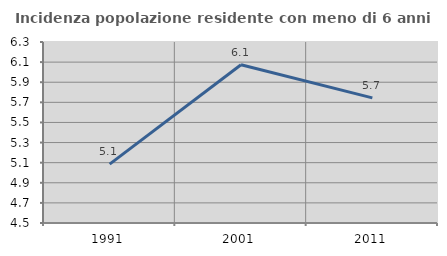
| Category | Incidenza popolazione residente con meno di 6 anni |
|---|---|
| 1991.0 | 5.086 |
| 2001.0 | 6.073 |
| 2011.0 | 5.744 |